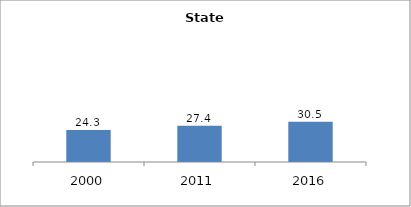
| Category | Series 0 |
|---|---|
| 2000.0 | 24.3 |
| 2011.0 | 27.4 |
| 2016.0 | 30.452 |